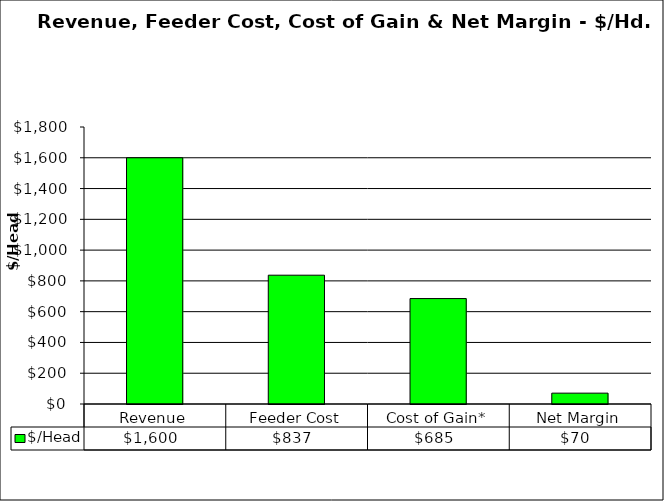
| Category | $/Head |
|---|---|
| Revenue | 1600.062 |
| Feeder Cost | 837.004 |
| Cost of Gain* | 685.151 |
| Net Margin | 70.467 |